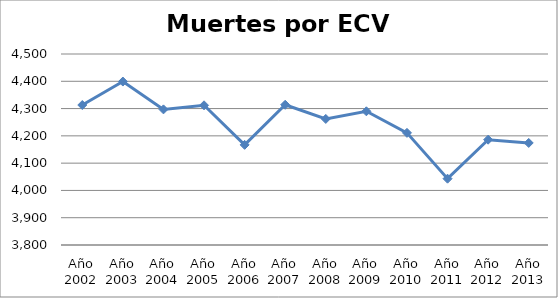
| Category | Series 0 |
|---|---|
| Año 2002 | 4313 |
| Año 2003 | 4399 |
| Año 2004 | 4297 |
| Año 2005 | 4312 |
| Año 2006 | 4167 |
| Año 2007 | 4314 |
| Año 2008 | 4262 |
| Año 2009 | 4290 |
| Año 2010 | 4211 |
| Año 2011 | 4043 |
| Año 2012 | 4186 |
| Año 2013 | 4174 |